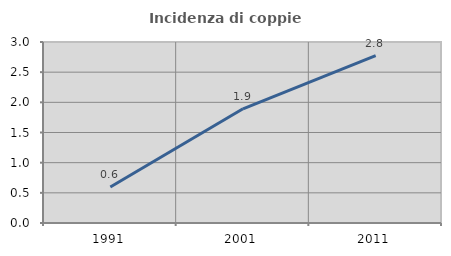
| Category | Incidenza di coppie miste |
|---|---|
| 1991.0 | 0.598 |
| 2001.0 | 1.893 |
| 2011.0 | 2.774 |